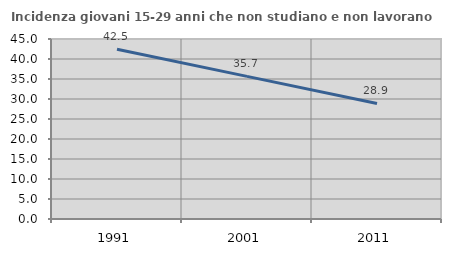
| Category | Incidenza giovani 15-29 anni che non studiano e non lavorano  |
|---|---|
| 1991.0 | 42.453 |
| 2001.0 | 35.651 |
| 2011.0 | 28.892 |